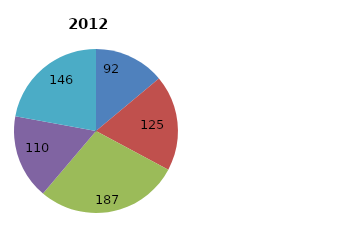
| Category | Series 0 |
|---|---|
| 0 | 91.816 |
| 1 | 124.53 |
| 2 | 187.122 |
| 3 | 109.991 |
| 4 | 145.876 |